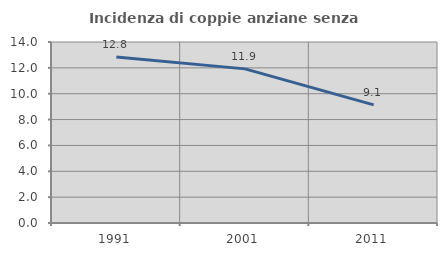
| Category | Incidenza di coppie anziane senza figli  |
|---|---|
| 1991.0 | 12.846 |
| 2001.0 | 11.922 |
| 2011.0 | 9.136 |